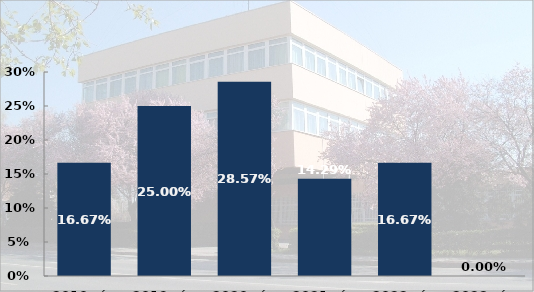
| Category | Ittasan okozott személysérüléses közúti közlekedési balesetek aránya |
|---|---|
| 2010. év | 0.167 |
| 2019. év | 0.25 |
| 2020. év | 0.286 |
| 2021. év | 0.143 |
| 2022. év | 0.167 |
| 2023. év | 0 |